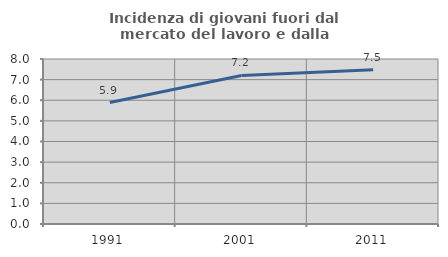
| Category | Incidenza di giovani fuori dal mercato del lavoro e dalla formazione  |
|---|---|
| 1991.0 | 5.888 |
| 2001.0 | 7.201 |
| 2011.0 | 7.485 |